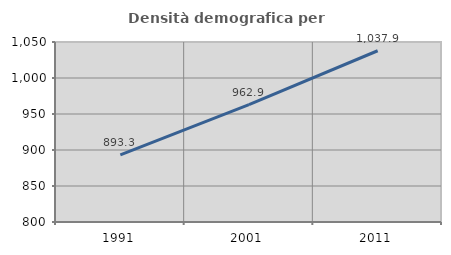
| Category | Densità demografica |
|---|---|
| 1991.0 | 893.25 |
| 2001.0 | 962.933 |
| 2011.0 | 1037.852 |